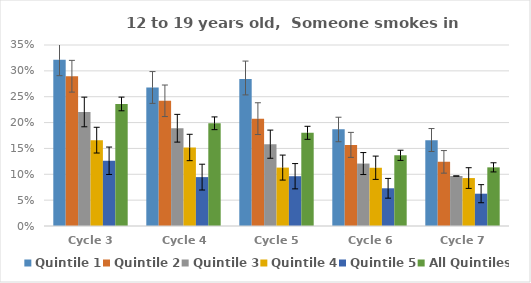
| Category | Quintile 1 | Quintile 2 | Quintile 3 | Quintile 4 | Quintile 5 | All Quintiles |
|---|---|---|---|---|---|---|
| Cycle 3 | 0.321 | 0.29 | 0.22 | 0.166 | 0.126 | 0.236 |
| Cycle 4 | 0.268 | 0.242 | 0.189 | 0.152 | 0.095 | 0.199 |
| Cycle 5 | 0.284 | 0.208 | 0.158 | 0.113 | 0.096 | 0.18 |
| Cycle 6 | 0.187 | 0.157 | 0.121 | 0.113 | 0.073 | 0.137 |
| Cycle 7 | 0.166 | 0.124 | 0.097 | 0.093 | 0.062 | 0.113 |